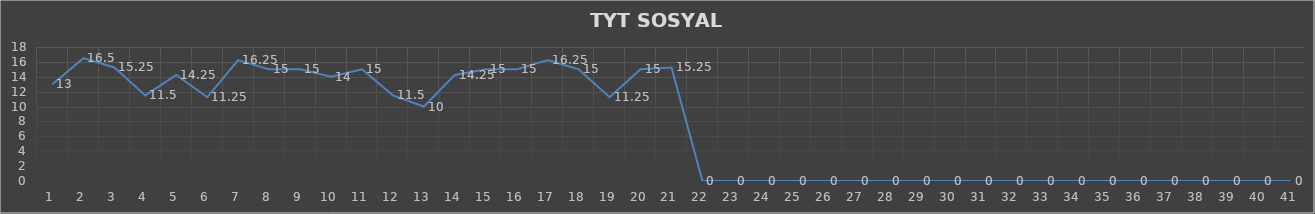
| Category | Series 0 |
|---|---|
| 0 | 13 |
| 1 | 16.5 |
| 2 | 15.25 |
| 3 | 11.5 |
| 4 | 14.25 |
| 5 | 11.25 |
| 6 | 16.25 |
| 7 | 15 |
| 8 | 15 |
| 9 | 14 |
| 10 | 15 |
| 11 | 11.5 |
| 12 | 10 |
| 13 | 14.25 |
| 14 | 15 |
| 15 | 15 |
| 16 | 16.25 |
| 17 | 15 |
| 18 | 11.25 |
| 19 | 15 |
| 20 | 15.25 |
| 21 | 0 |
| 22 | 0 |
| 23 | 0 |
| 24 | 0 |
| 25 | 0 |
| 26 | 0 |
| 27 | 0 |
| 28 | 0 |
| 29 | 0 |
| 30 | 0 |
| 31 | 0 |
| 32 | 0 |
| 33 | 0 |
| 34 | 0 |
| 35 | 0 |
| 36 | 0 |
| 37 | 0 |
| 38 | 0 |
| 39 | 0 |
| 40 | 0 |